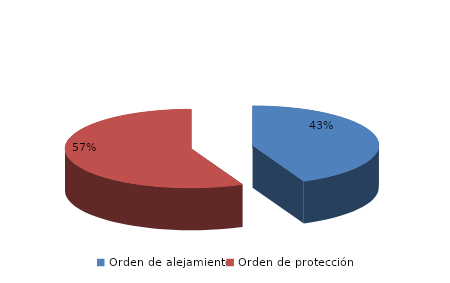
| Category | Series 0 |
|---|---|
| Orden de alejamiento | 495 |
| Orden de protección | 647 |